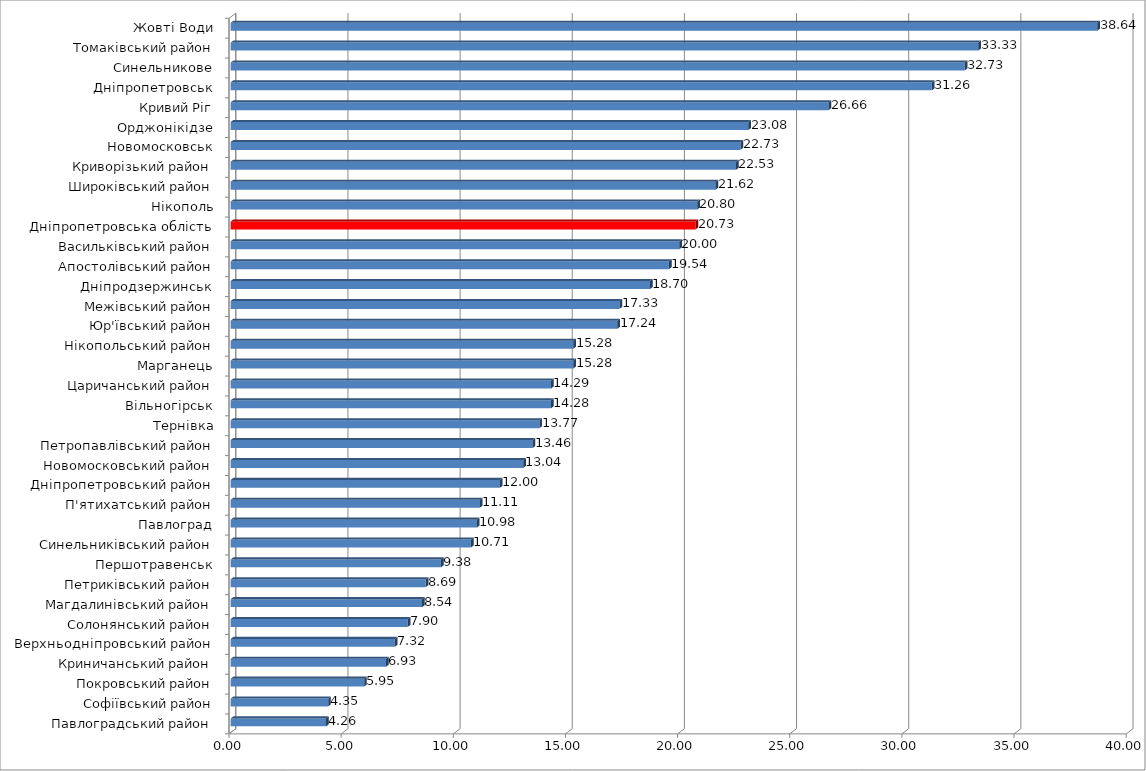
| Category | Series 0 |
|---|---|
| Павлоградський район | 4.255 |
| Софіївський район | 4.347 |
| Покровський район | 5.952 |
| Криничанський район | 6.931 |
| Верхньодніпровський район | 7.316 |
| Солонянський район | 7.895 |
| Магдалинівський район | 8.537 |
| Петриківський район | 8.695 |
| Першотравенськ | 9.376 |
| Синельниківський район | 10.714 |
| Павлоград | 10.975 |
| П'ятихатський район | 11.111 |
| Дніпропетровський район | 12 |
| Новомосковський район | 13.045 |
| Петропавлівський район | 13.46 |
| Тернівка | 13.765 |
| Вільногірськ | 14.283 |
| Царичанський район | 14.288 |
| Марганець | 15.277 |
| Нікопольський район | 15.278 |
| Юр'ївський район | 17.24 |
| Межівський район | 17.333 |
| Дніпродзержинськ | 18.699 |
| Апостолівський район | 19.54 |
| Васильківський район | 19.999 |
| Дніпропетровська облість | 20.726 |
| Нікополь | 20.8 |
| Широківський район | 21.622 |
| Криворізький район | 22.532 |
| Новомосковськ | 22.727 |
| Орджонікідзе | 23.078 |
| Кривий Ріг | 26.657 |
| Дніпропетровськ | 31.263 |
| Синельникове | 32.727 |
| Томаківський район | 33.333 |
| Жовті Води | 38.639 |